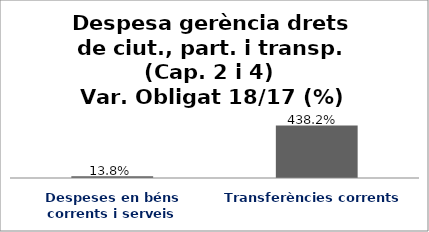
| Category | Series 0 |
|---|---|
| Despeses en béns corrents i serveis | 0.138 |
| Transferències corrents | 4.382 |